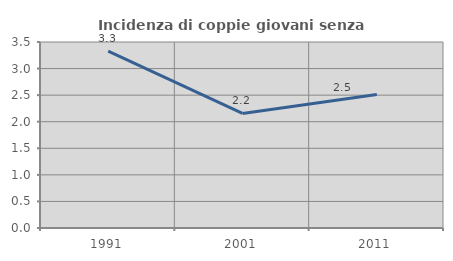
| Category | Incidenza di coppie giovani senza figli |
|---|---|
| 1991.0 | 3.327 |
| 2001.0 | 2.155 |
| 2011.0 | 2.513 |